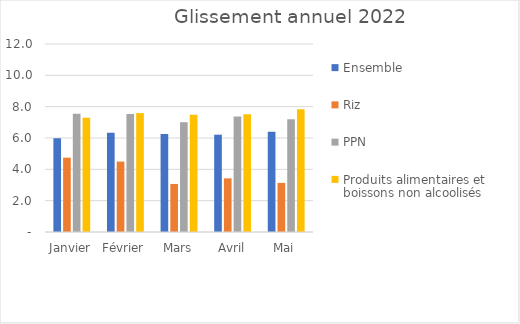
| Category |  Ensemble  |  Riz  |  PPN  |  Produits alimentaires et boissons non alcoolisés  |
|---|---|---|---|---|
| Janvier | 5.984 | 4.745 | 7.54 | 7.297 |
| Février | 6.337 | 4.495 | 7.537 | 7.591 |
| Mars | 6.249 | 3.066 | 7.006 | 7.484 |
| Avril | 6.212 | 3.424 | 7.38 | 7.523 |
| Mai | 6.399 | 3.134 | 7.195 | 7.832 |